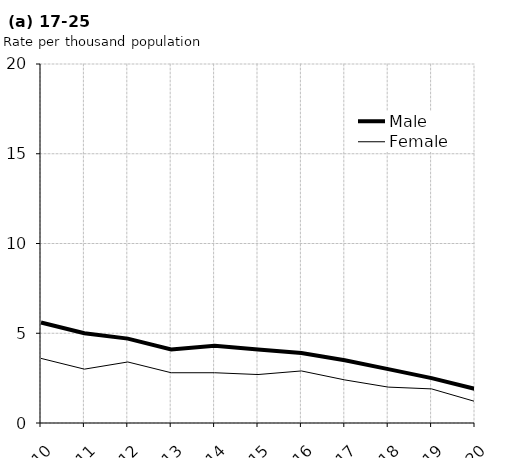
| Category | Male | Female |
|---|---|---|
| 2010.0 | 5.6 | 3.6 |
| 2011.0 | 5 | 3 |
| 2012.0 | 4.7 | 3.4 |
| 2013.0 | 4.1 | 2.8 |
| 2014.0 | 4.3 | 2.8 |
| 2015.0 | 4.1 | 2.7 |
| 2016.0 | 3.9 | 2.9 |
| 2017.0 | 3.5 | 2.4 |
| 2018.0 | 3 | 2 |
| 2019.0 | 2.5 | 1.9 |
| 2020.0 | 1.9 | 1.2 |